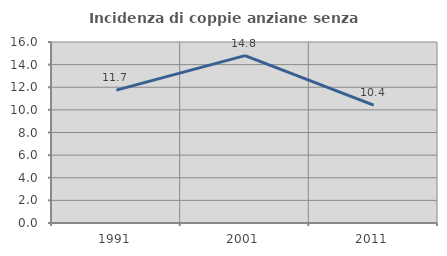
| Category | Incidenza di coppie anziane senza figli  |
|---|---|
| 1991.0 | 11.745 |
| 2001.0 | 14.793 |
| 2011.0 | 10.417 |